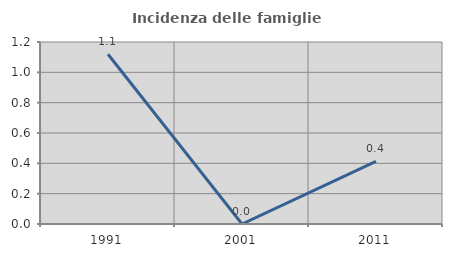
| Category | Incidenza delle famiglie numerose |
|---|---|
| 1991.0 | 1.119 |
| 2001.0 | 0 |
| 2011.0 | 0.413 |